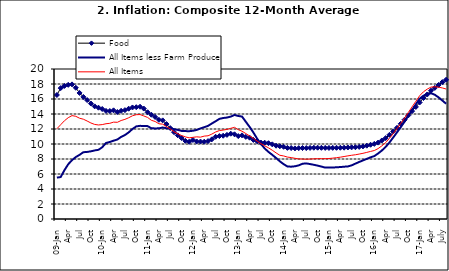
| Category | Food | All Items less Farm Produce | All Items |
|---|---|---|---|
| 09-Jan | 16.536 | 5.519 | 12.032 |
| Feb | 17.454 | 5.591 | 12.567 |
| Mar | 17.742 | 6.51 | 13.101 |
| Apr | 17.89 | 7.302 | 13.51 |
| May | 17.949 | 7.847 | 13.787 |
| June | 17.498 | 8.259 | 13.694 |
| Jul | 16.808 | 8.554 | 13.437 |
| Aug | 16.278 | 8.906 | 13.307 |
| Sep | 15.859 | 8.942 | 13.065 |
| Oct | 15.396 | 9.024 | 12.803 |
| Nov | 15.018 | 9.143 | 12.609 |
| Dec | 14.841 | 9.226 | 12.538 |
| 10-Jan | 14.668 | 9.567 | 12.586 |
| Feb | 14.411 | 10.138 | 12.7 |
| Mar | 14.395 | 10.269 | 12.757 |
| Apr | 14.489 | 10.444 | 12.915 |
| May | 14.266 | 10.597 | 12.893 |
| Jun | 14.424 | 10.948 | 13.132 |
| Jul | 14.514 | 11.193 | 13.284 |
| Aug | 14.706 | 11.549 | 13.5 |
| Sep | 14.872 | 11.997 | 13.764 |
| Oct | 14.906 | 12.345 | 13.908 |
| Nov | 14.967 | 12.423 | 13.928 |
| Dec | 14.723 | 12.383 | 13.74 |
| 11-Jan | 14.233 | 12.385 | 13.542 |
| Feb | 13.903 | 12.099 | 13.161 |
| Mar | 13.606 | 12.077 | 13.001 |
| Apr | 13.227 | 12.088 | 12.694 |
| May | 13.152 | 12.198 | 12.648 |
| Jun | 12.654 | 12.1 | 12.321 |
| Jul | 12.118 | 12.109 | 12.009 |
| Aug | 11.575 | 11.98 | 11.635 |
| Sep | 11.155 | 11.877 | 11.363 |
| Oct | 10.797 | 11.746 | 11.13 |
| Nov | 10.422 | 11.721 | 10.952 |
| Dec | 10.298 | 11.706 | 10.826 |
| 12-Jan | 10.538 | 11.765 | 10.886 |
| 12-Feb | 10.336 | 11.872 | 10.955 |
| 12-Mar | 10.325 | 12.075 | 10.914 |
| Apr | 10.304 | 12.242 | 11.054 |
| May | 10.387 | 12.419 | 11.096 |
| Jun | 10.617 | 12.732 | 11.32 |
| Jul | 10.963 | 13.032 | 11.599 |
| Aug | 11.056 | 13.349 | 11.791 |
| Sep | 11.104 | 13.467 | 11.859 |
| Oct | 11.216 | 13.525 | 11.948 |
| Nov | 11.372 | 13.649 | 12.091 |
| Dec | 11.296 | 13.873 | 12.224 |
| 13-Jan | 11.055 | 13.737 | 11.908 |
| Feb | 11.153 | 13.657 | 11.703 |
| Mar | 10.951 | 12.963 | 11.394 |
| Apr | 10.844 | 12.281 | 11.072 |
| May | 10.548 | 11.531 | 10.761 |
| Jun | 10.352 | 10.704 | 10.383 |
| Jul | 10.186 | 10.005 | 10.047 |
| Aug | 10.168 | 9.4 | 9.761 |
| Sep | 10.105 | 8.939 | 9.486 |
| Oct | 9.955 | 8.553 | 9.167 |
| Nov | 9.774 | 8.136 | 8.815 |
| Dec | 9.695 | 7.691 | 8.496 |
| 14-Jan | 9.626 | 7.317 | 8.408 |
| Feb | 9.484 | 7.005 | 8.257 |
| Mar | 9.464 | 6.976 | 8.19 |
| Apr | 9.416 | 7.03 | 8.092 |
| May | 9.448 | 7.151 | 8.012 |
| Jun | 9.464 | 7.369 | 7.998 |
| Jul | 9.459 | 7.411 | 7.968 |
| Aug | 9.481 | 7.325 | 7.996 |
| Sep | 9.501 | 7.228 | 8.027 |
| Oct | 9.508 | 7.116 | 8.047 |
| Nov | 9.492 | 6.991 | 8.046 |
| Dec | 9.481 | 6.854 | 8.047 |
| 15-Jan | 9.475 | 6.865 | 8.063 |
| Feb | 9.486 | 6.852 | 8.117 |
| Mar | 9.495 | 6.905 | 8.176 |
| Apr | 9.501 | 6.922 | 8.243 |
| May | 9.51 | 6.975 | 8.331 |
| Jun | 9.535 | 7.006 | 8.417 |
| Jul | 9.552 | 7.154 | 8.497 |
| Aug | 9.571 | 7.384 | 8.566 |
| Sep | 9.614 | 7.605 | 8.658 |
| Oct | 9.68 | 7.812 | 8.76 |
| Nov | 9.778 | 8.016 | 8.879 |
| Dec | 9.898 | 8.222 | 9.009 |
| 16-Jan | 10.017 | 8.391 | 9.13 |
| Feb | 10.184 | 8.732 | 9.386 |
| Mar | 10.471 | 9.132 | 9.751 |
| Apr | 10.786 | 9.614 | 10.182 |
| May | 11.221 | 10.196 | 10.746 |
| Jun | 11.672 | 10.864 | 11.372 |
| Jul | 12.162 | 11.553 | 12.045 |
| Aug | 12.696 | 12.247 | 12.744 |
| Sep | 13.238 | 12.98 | 13.454 |
| Oct | 13.817 | 13.757 | 14.206 |
| Nov | 14.386 | 14.542 | 14.958 |
| Dec | 14.946 | 15.307 | 15.697 |
| 17-Jan | 15.536 | 16.042 | 16.441 |
| Feb | 16.127 | 16.436 | 16.958 |
| Mar | 16.598 | 16.682 | 17.315 |
| Apr | 17.106 | 16.772 | 17.591 |
| May | 17.477 | 16.567 | 17.628 |
| June | 17.868 | 16.219 | 17.578 |
| July | 18.247 | 15.798 | 17.475 |
| August | 18.569 | 15.372 | 17.331 |